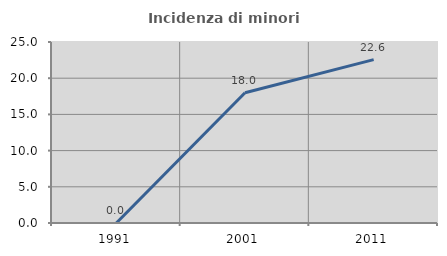
| Category | Incidenza di minori stranieri |
|---|---|
| 1991.0 | 0 |
| 2001.0 | 18 |
| 2011.0 | 22.561 |